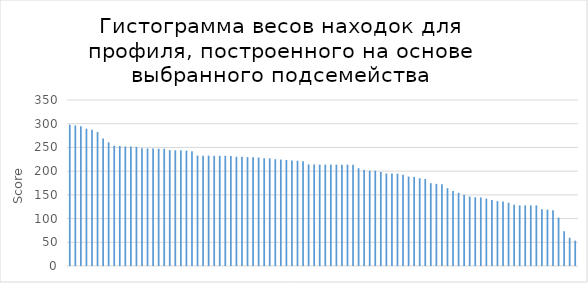
| Category | Series 0 |
|---|---|
| 0 | 298 |
| 1 | 296.3 |
| 2 | 294.8 |
| 3 | 289.5 |
| 4 | 287.3 |
| 5 | 282.6 |
| 6 | 268.8 |
| 7 | 260.8 |
| 8 | 253.6 |
| 9 | 253 |
| 10 | 252 |
| 11 | 251.9 |
| 12 | 251.1 |
| 13 | 248.5 |
| 14 | 247.8 |
| 15 | 247.7 |
| 16 | 247.2 |
| 17 | 247.2 |
| 18 | 244.3 |
| 19 | 243.9 |
| 20 | 243.9 |
| 21 | 243.3 |
| 22 | 241.8 |
| 23 | 232.8 |
| 24 | 232.7 |
| 25 | 232.7 |
| 26 | 232.4 |
| 27 | 232.4 |
| 28 | 232.4 |
| 29 | 232 |
| 30 | 230.3 |
| 31 | 230.3 |
| 32 | 229.6 |
| 33 | 229.4 |
| 34 | 228.7 |
| 35 | 227.3 |
| 36 | 226.9 |
| 37 | 225.2 |
| 38 | 224.4 |
| 39 | 223.6 |
| 40 | 222.4 |
| 41 | 221.9 |
| 42 | 221 |
| 43 | 214.3 |
| 44 | 214.1 |
| 45 | 213.8 |
| 46 | 213.8 |
| 47 | 213.8 |
| 48 | 213.8 |
| 49 | 213.6 |
| 50 | 213.6 |
| 51 | 213.4 |
| 52 | 206.1 |
| 53 | 202.6 |
| 54 | 201.1 |
| 55 | 201 |
| 56 | 198.4 |
| 57 | 194.9 |
| 58 | 194.9 |
| 59 | 194.7 |
| 60 | 192.3 |
| 61 | 188.6 |
| 62 | 187.6 |
| 63 | 185 |
| 64 | 183.6 |
| 65 | 174.6 |
| 66 | 173.2 |
| 67 | 172.4 |
| 68 | 164.1 |
| 69 | 157.9 |
| 70 | 154.3 |
| 71 | 150.1 |
| 72 | 146.5 |
| 73 | 144.9 |
| 74 | 144.6 |
| 75 | 142.1 |
| 76 | 139.1 |
| 77 | 136.7 |
| 78 | 136.2 |
| 79 | 133.3 |
| 80 | 129.1 |
| 81 | 127.8 |
| 82 | 127.8 |
| 83 | 127.8 |
| 84 | 127.8 |
| 85 | 119.6 |
| 86 | 118.8 |
| 87 | 117.8 |
| 88 | 102.1 |
| 89 | 73.3 |
| 90 | 59.6 |
| 91 | 53.4 |